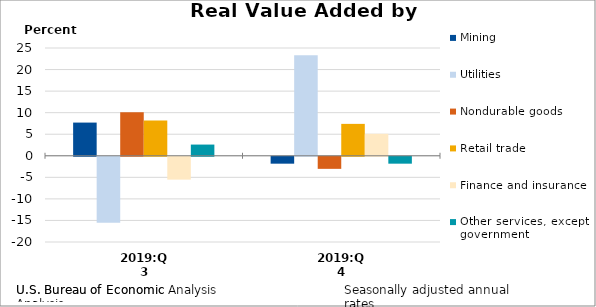
| Category | Mining | Utilities | Nondurable goods | Retail trade | Finance and insurance | Other services, except government |
|---|---|---|---|---|---|---|
| 2019:Q3 | 7.7 | -15.3 | 10.1 | 8.2 | -5.3 | 2.6 |
| 2019:Q4 | -1.6 | 23.3 | -2.8 | 7.4 | 5.1 | -1.6 |